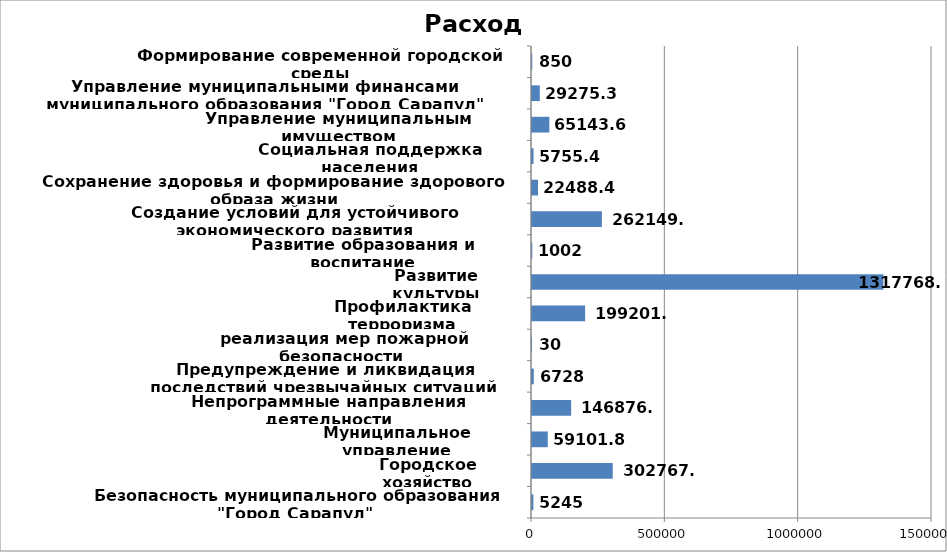
| Category | Итог |
|---|---|
| Безопасность муниципального образования "Город Сарапул"  | 5245 |
| Городское хозяйство | 302767.4 |
| Муниципальное управление | 59101.8 |
| Непрограммные направления деятельности | 146876.8 |
| Предупреждение и ликвидация последствий чрезвычайных ситуаций, реализация мер пожарной безопасности | 6728 |
| Профилактика терроризма | 30 |
| Развитие культуры | 199201.3 |
| Развитие образования и воспитание | 1317768.8 |
| Создание условий для устойчивого экономического развития | 1002 |
| Сохранение здоровья и формирование здорового образа жизни | 262149.1 |
| Социальная поддержка населения | 22488.4 |
| Управление муниципальным имуществом | 5755.4 |
| Управление муниципальными финансами муниципального образования "Город Сарапул" | 65143.6 |
| Формирование современной городской среды | 29275.3 |
| Энергосбережение и повышение энергетической эффективности | 850 |